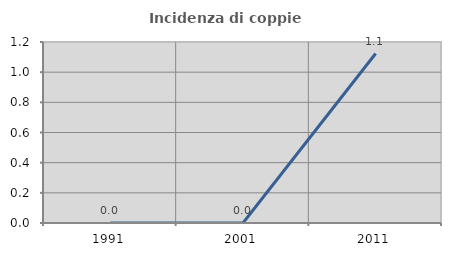
| Category | Incidenza di coppie miste |
|---|---|
| 1991.0 | 0 |
| 2001.0 | 0 |
| 2011.0 | 1.124 |